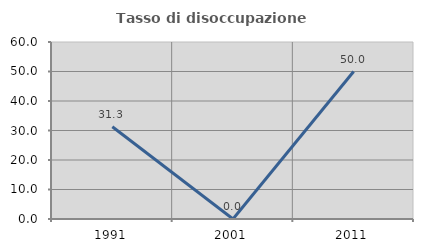
| Category | Tasso di disoccupazione giovanile  |
|---|---|
| 1991.0 | 31.25 |
| 2001.0 | 0 |
| 2011.0 | 50 |